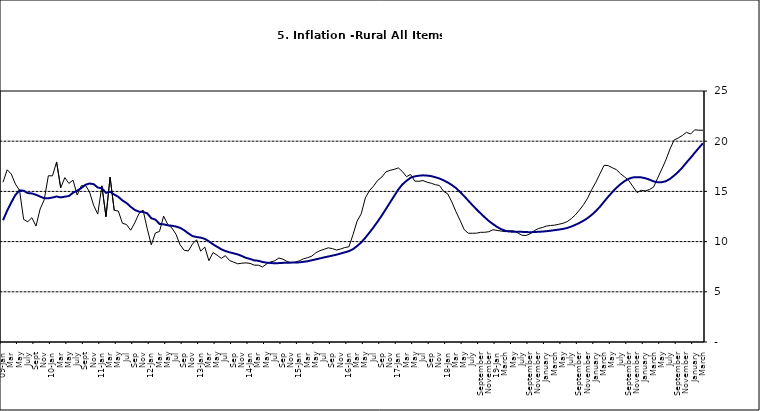
| Category | Series 0 | Series 1 |
|---|---|---|
| 09-Jan | 15.918 | 12.128 |
| Feb | 17.154 | 13.086 |
| Mar | 16.729 | 13.912 |
| Apr | 15.727 | 14.644 |
| May | 15.113 | 15.104 |
| June | 12.213 | 15.067 |
| July | 11.974 | 14.832 |
| Aug | 12.38 | 14.796 |
| Sept | 11.548 | 14.661 |
| Oct | 13.242 | 14.488 |
| Nov | 14.164 | 14.321 |
|  | 16.557 | 14.316 |
| 10-Jan | 16.548 | 14.39 |
| Feb | 17.934 | 14.494 |
| Mar | 15.346 | 14.401 |
| Apr | 16.373 | 14.473 |
| May | 15.794 | 14.54 |
| June | 16.126 | 14.862 |
| July | 14.634 | 15.072 |
| Aug | 15.556 | 15.33 |
| Sept | 15.616 | 15.658 |
| Oct | 14.955 | 15.786 |
| Nov | 13.616 | 15.719 |
| Dec | 12.735 | 15.385 |
| 11-Jan | 15.553 | 15.311 |
| Feb | 12.482 | 14.856 |
| Mar | 16.422 | 14.956 |
| Apr | 13.117 | 14.687 |
| May | 13.041 | 14.457 |
| Jun | 11.83 | 14.095 |
| Jul | 11.699 | 13.84 |
| Aug | 11.13 | 13.464 |
| Sep | 11.878 | 13.156 |
| Oct | 12.778 | 12.985 |
| Nov | 13.147 | 12.95 |
| Dec | 11.326 | 12.824 |
| 12-Jan | 9.678 | 12.33 |
| Feb | 10.856 | 12.188 |
| Mar | 11.014 | 11.76 |
| Apr | 12.536 | 11.724 |
| May | 11.712 | 11.621 |
| Jun | 11.36 | 11.582 |
| Jul | 10.733 | 11.499 |
| Aug | 9.683 | 11.368 |
| Sep | 9.132 | 11.131 |
| Oct | 9.071 | 10.82 |
| Nov | 9.758 | 10.548 |
| Dec | 10.183 | 10.455 |
| 13-Jan | 9.052 | 10.394 |
| Feb | 9.457 | 10.276 |
| Mar | 8.091 | 10.025 |
| Apr | 8.907 | 9.732 |
| May | 8.647 | 9.483 |
| Jun | 8.333 | 9.236 |
| Jul | 8.6 | 9.063 |
| Aug | 8.12 | 8.933 |
| Sep | 7.95 | 8.832 |
| Oct | 7.791 | 8.722 |
| Nov | 7.849 | 8.565 |
| Dec | 7.879 | 8.378 |
| 14-Jan | 7.832 | 8.277 |
| Feb | 7.657 | 8.13 |
| Mar | 7.65 | 8.092 |
| Apr | 7.473 | 7.973 |
| May | 7.761 | 7.901 |
| Jun | 7.98 | 7.874 |
| Jul | 8.086 | 7.834 |
| Aug | 8.368 | 7.858 |
| Sep | 8.244 | 7.883 |
| Oct | 8.019 | 7.903 |
| Nov | 7.898 | 7.906 |
| Dec | 7.955 | 7.913 |
| 15-Jan | 8.094 | 7.935 |
| Feb | 8.291 | 7.988 |
| Mar | 8.396 | 8.05 |
| Apr | 8.556 | 8.14 |
| May | 8.896 | 8.236 |
| Jun | 9.098 | 8.331 |
| Jul | 9.238 | 8.429 |
| Aug | 9.382 | 8.516 |
| Sep | 9.3 | 8.606 |
| Oct | 9.162 | 8.7 |
| Nov | 9.261 | 8.813 |
| Dec | 9.41 | 8.933 |
| 16-Jan | 9.48 | 9.047 |
| Feb | 10.692 | 9.249 |
| Mar | 12.038 | 9.559 |
| Apr | 12.767 | 9.917 |
| May | 14.349 | 10.384 |
| Jun | 15.088 | 10.897 |
| Jul | 15.533 | 11.433 |
| Aug | 16.103 | 12.002 |
| Sep | 16.428 | 12.601 |
| Oct | 16.947 | 13.25 |
| Nov | 17.099 | 13.898 |
| Dec | 17.195 | 14.54 |
| 17-Jan | 17.341 | 15.183 |
| Feb | 16.982 | 15.696 |
| Mar | 16.466 | 16.054 |
| Apr | 16.687 | 16.369 |
| May | 16.023 | 16.497 |
| Jun | 16.007 | 16.563 |
| Jul | 16.078 | 16.6 |
| Aug | 15.914 | 16.577 |
| Sep | 15.812 | 16.52 |
| Oct | 15.666 | 16.411 |
| Nov | 15.587 | 16.285 |
| Dec | 15.018 | 16.104 |
| 18-Jan | 14.756 | 15.892 |
| Feb | 13.957 | 15.638 |
| Mar | 12.987 | 15.339 |
| Apr | 12.126 | 14.95 |
| May | 11.199 | 14.53 |
| June | 10.832 | 14.083 |
| July | 10.831 | 13.636 |
| August | 10.838 | 13.209 |
| September | 10.924 | 12.804 |
| October | 10.927 | 12.418 |
| November | 10.986 | 12.049 |
| December | 11.183 | 11.746 |
| 19-Jan | 11.115 | 11.462 |
| February | 11.048 | 11.234 |
| March | 10.99 | 11.078 |
| April | 11.08 | 10.997 |
| May | 11.075 | 10.988 |
| June | 10.874 | 10.99 |
| July | 10.636 | 10.972 |
| August | 10.609 | 10.951 |
| September | 10.771 | 10.937 |
| October | 11.074 | 10.95 |
| November | 11.296 | 10.977 |
| December | 11.406 | 10.998 |
| January | 11.543 | 11.037 |
| February | 11.606 | 11.086 |
| March | 11.639 | 11.141 |
| April | 11.728 | 11.197 |
| May | 11.826 | 11.261 |
| June | 11.988 | 11.355 |
| July | 12.28 | 11.493 |
| August | 12.651 | 11.664 |
| September | 13.14 | 11.864 |
| October | 13.68 | 12.086 |
| November | 14.335 | 12.346 |
| December | 15.2 | 12.67 |
| January | 15.918 | 13.043 |
| February | 16.766 | 13.482 |
| March | 17.596 | 13.985 |
| April | 17.566 | 14.475 |
| May | 17.358 | 14.935 |
| June | 17.159 | 15.362 |
| July | 16.753 | 15.726 |
| August | 16.433 | 16.03 |
| September | 16.081 | 16.26 |
| October | 15.48 | 16.393 |
| November | 14.89 | 16.419 |
| December | 15.106 | 16.397 |
| January | 15.055 | 16.313 |
| February | 15.179 | 16.176 |
| March | 15.421 | 15.999 |
| April | 16.321 | 15.908 |
| May | 17.215 | 15.915 |
| June | 18.128 | 16.017 |
| July | 19.224 | 16.246 |
| August | 20.118 | 16.575 |
| September | 20.322 | 16.944 |
| October | 20.572 | 17.376 |
| November | 20.882 | 17.876 |
| December | 20.718 | 18.342 |
| January | 21.134 | 18.844 |
| February | 21.096 | 19.329 |
| March | 21.088 | 19.79 |